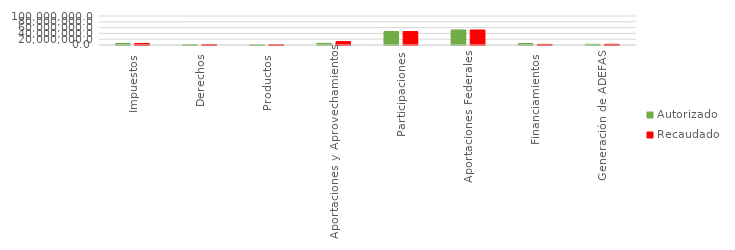
| Category | Autorizado | Recaudado |
|---|---|---|
| Impuestos | 4924393 | 5339600.1 |
| Derechos | 1215225 | 1408827.7 |
| Productos | 470522 | 841810.6 |
| Aportaciones y Aprovechamientos | 5686387 | 11712905.5 |
| Participaciones | 46431877.7 | 46431877.7 |
| Aportaciones Federales | 51787106.6 | 51787106.6 |
| Financiamientos | 5000000 | 2034701.5 |
| Generación de ADEFAS | 2466112 | 2460882.1 |